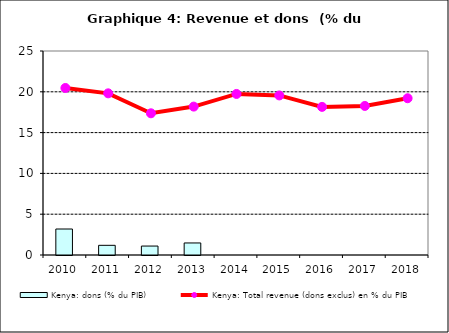
| Category | Kenya: dons (% du PIB) |
|---|---|
| 2010.0 | 3.185 |
| 2011.0 | 1.186 |
| 2012.0 | 1.096 |
| 2013.0 | 1.475 |
| 2014.0 | 0 |
| 2015.0 | 0 |
| 2016.0 | 0 |
| 2017.0 | 0 |
| 2018.0 | 0 |